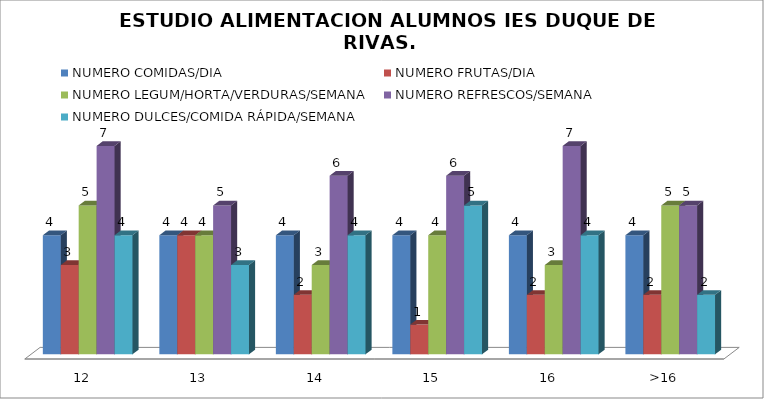
| Category | NUMERO COMIDAS/DIA | NUMERO FRUTAS/DIA | NUMERO LEGUM/HORTA/VERDURAS/SEMANA | NUMERO REFRESCOS/SEMANA | NUMERO DULCES/COMIDA RÁPIDA/SEMANA |
|---|---|---|---|---|---|
| 12 | 4 | 3 | 5 | 7 | 4 |
| 13 | 4 | 4 | 4 | 5 | 3 |
| 14 | 4 | 2 | 3 | 6 | 4 |
| 15 | 4 | 1 | 4 | 6 | 5 |
| 16 | 4 | 2 | 3 | 7 | 4 |
| >16 | 4 | 2 | 5 | 5 | 2 |